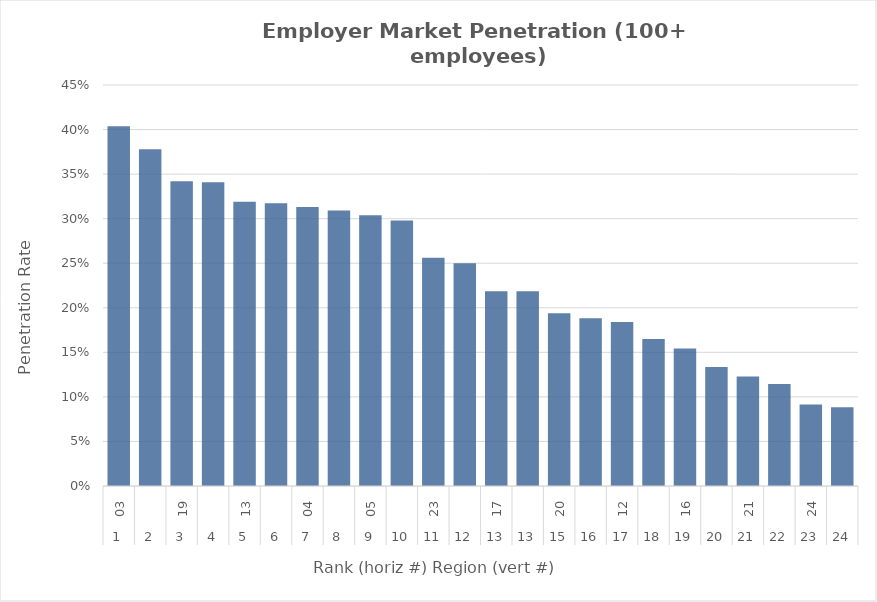
| Category | Rate |
|---|---|
| 0 | 0.404 |
| 1 | 0.378 |
| 2 | 0.342 |
| 3 | 0.341 |
| 4 | 0.319 |
| 5 | 0.317 |
| 6 | 0.313 |
| 7 | 0.309 |
| 8 | 0.304 |
| 9 | 0.298 |
| 10 | 0.256 |
| 11 | 0.25 |
| 12 | 0.219 |
| 13 | 0.219 |
| 14 | 0.194 |
| 15 | 0.188 |
| 16 | 0.184 |
| 17 | 0.165 |
| 18 | 0.154 |
| 19 | 0.134 |
| 20 | 0.123 |
| 21 | 0.114 |
| 22 | 0.091 |
| 23 | 0.088 |